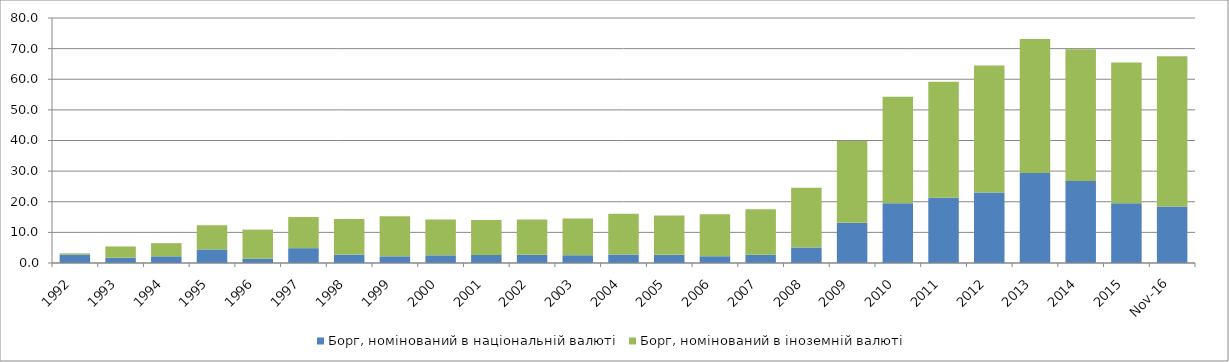
| Category | Борг, номінований в національній валюті | Борг, номінований в іноземній валюті |
|---|---|---|
| 1992.0 | 2.743 | 0.404 |
| 1993.0 | 1.732 | 3.661 |
| 1994.0 | 2.184 | 4.292 |
| 1995.0 | 4.433 | 7.895 |
| 1996.0 | 1.427 | 9.468 |
| 1997.0 | 4.845 | 10.164 |
| 1998.0 | 2.759 | 11.647 |
| 1999.0 | 2.176 | 13.072 |
| 2000.0 | 2.507 | 11.657 |
| 2001.0 | 2.65 | 11.419 |
| 2002.0 | 2.694 | 11.508 |
| 2003.0 | 2.533 | 12.01 |
| 2004.0 | 2.766 | 13.331 |
| 2005.0 | 2.666 | 12.809 |
| 2006.0 | 2.205 | 13.745 |
| 2007.0 | 2.69 | 14.883 |
| 2008.0 | 5.06 | 19.539 |
| 2009.0 | 13.143 | 26.67 |
| 2010.0 | 19.538 | 34.76 |
| 2011.0 | 21.329 | 37.894 |
| 2012.0 | 23.046 | 41.449 |
| 2013.0 | 29.397 | 43.765 |
| 2014.0 | 26.747 | 43.065 |
| 2015.0 | 19.515 | 45.99 |
| 42704.0 | 18.428 | 49.108 |